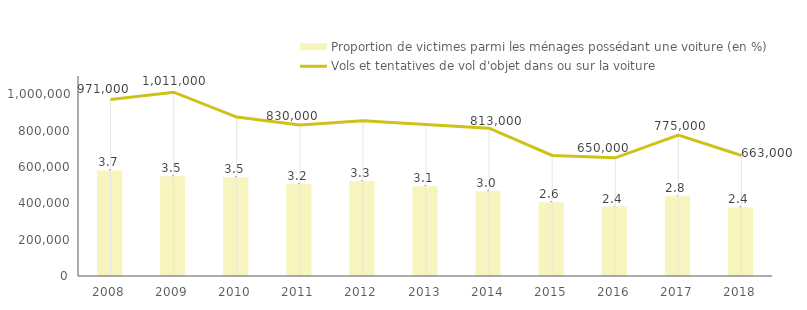
| Category | Proportion de victimes parmi les ménages possédant une voiture (en %) |
|---|---|
| 2008.0 | 3.696 |
| 2009.0 | 3.491 |
| 2010.0 | 3.458 |
| 2011.0 | 3.219 |
| 2012.0 | 3.316 |
| 2013.0 | 3.143 |
| 2014.0 | 2.967 |
| 2015.0 | 2.583 |
| 2016.0 | 2.432 |
| 2017.0 | 2.81 |
| 2018.0 | 2.406 |